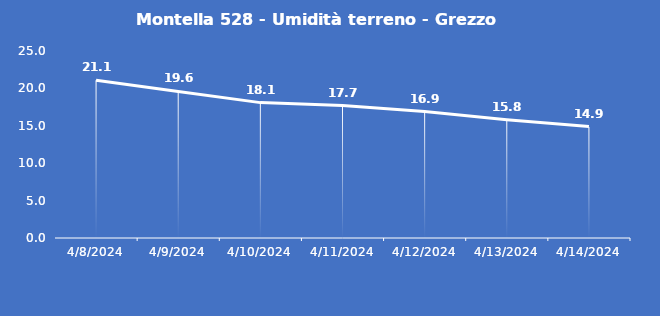
| Category | Montella 528 - Umidità terreno - Grezzo (%VWC) |
|---|---|
| 4/8/24 | 21.1 |
| 4/9/24 | 19.6 |
| 4/10/24 | 18.1 |
| 4/11/24 | 17.7 |
| 4/12/24 | 16.9 |
| 4/13/24 | 15.8 |
| 4/14/24 | 14.9 |